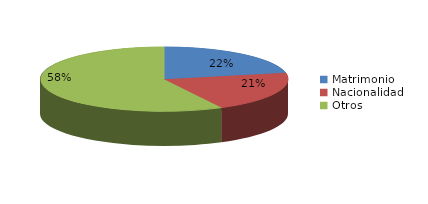
| Category | Series 0 |
|---|---|
| Matrimonio | 655 |
| Nacionalidad | 615 |
| Otros | 1728 |